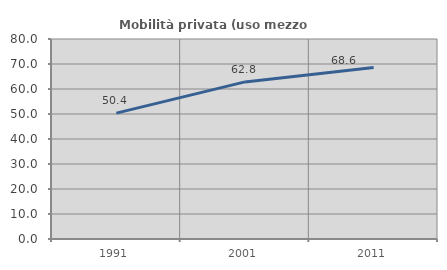
| Category | Mobilità privata (uso mezzo privato) |
|---|---|
| 1991.0 | 50.358 |
| 2001.0 | 62.833 |
| 2011.0 | 68.564 |